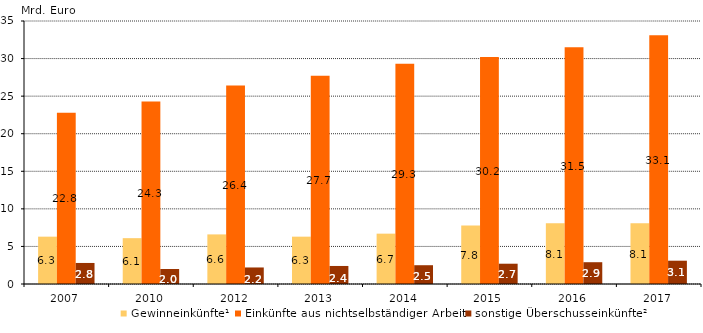
| Category | Gewinneinkünfte¹ | Einkünfte aus nichtselbständiger Arbeit | sonstige Überschusseinkünfte² |
|---|---|---|---|
| 2007.0 | 6.3 | 22.8 | 2.8 |
| 2010.0 | 6.1 | 24.3 | 2 |
| 2012.0 | 6.6 | 26.4 | 2.2 |
| 2013.0 | 6.3 | 27.7 | 2.4 |
| 2014.0 | 6.7 | 29.3 | 2.5 |
| 2015.0 | 7.8 | 30.2 | 2.7 |
| 2016.0 | 8.1 | 31.5 | 2.9 |
| 2017.0 | 8.1 | 33.1 | 3.1 |